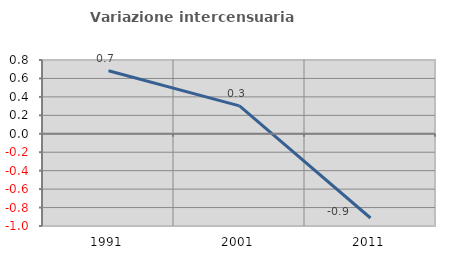
| Category | Variazione intercensuaria annua |
|---|---|
| 1991.0 | 0.684 |
| 2001.0 | 0.302 |
| 2011.0 | -0.913 |